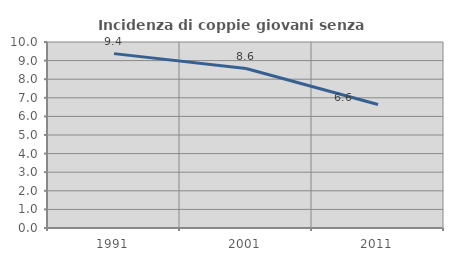
| Category | Incidenza di coppie giovani senza figli |
|---|---|
| 1991.0 | 9.375 |
| 2001.0 | 8.573 |
| 2011.0 | 6.641 |